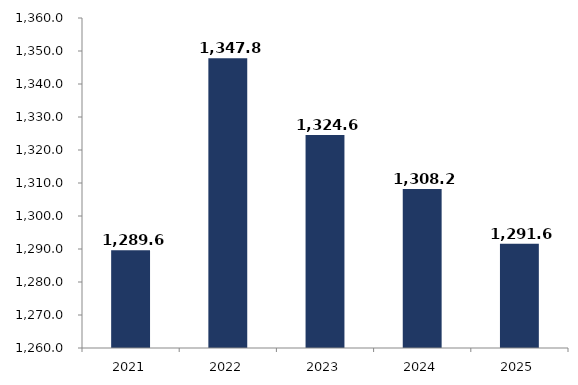
| Category | Series 1 |
|---|---|
| 2021.0 | 1289.646 |
| 2022.0 | 1347.828 |
| 2023.0 | 1324.574 |
| 2024.0 | 1308.206 |
| 2025.0 | 1291.583 |